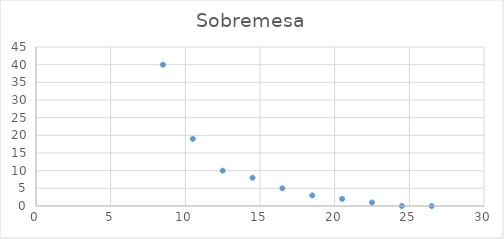
| Category | Sobremesa |
|---|---|
| 8.5 | 40 |
| 10.5 | 19 |
| 12.5 | 10 |
| 14.5 | 8 |
| 16.5 | 5 |
| 18.5 | 3 |
| 20.5 | 2 |
| 22.5 | 1 |
| 24.5 | 0 |
| 26.5 | 0 |